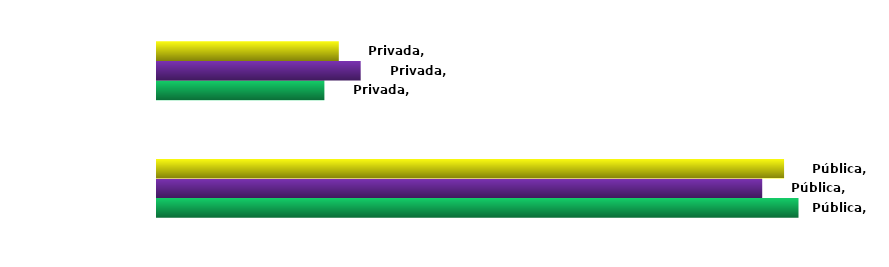
| Category | Ingressantes | Concluintes | Matriculados |
|---|---|---|---|
| Pública | 0.793 | 0.748 | 0.775 |
| Privada | 0.207 | 0.252 | 0.225 |